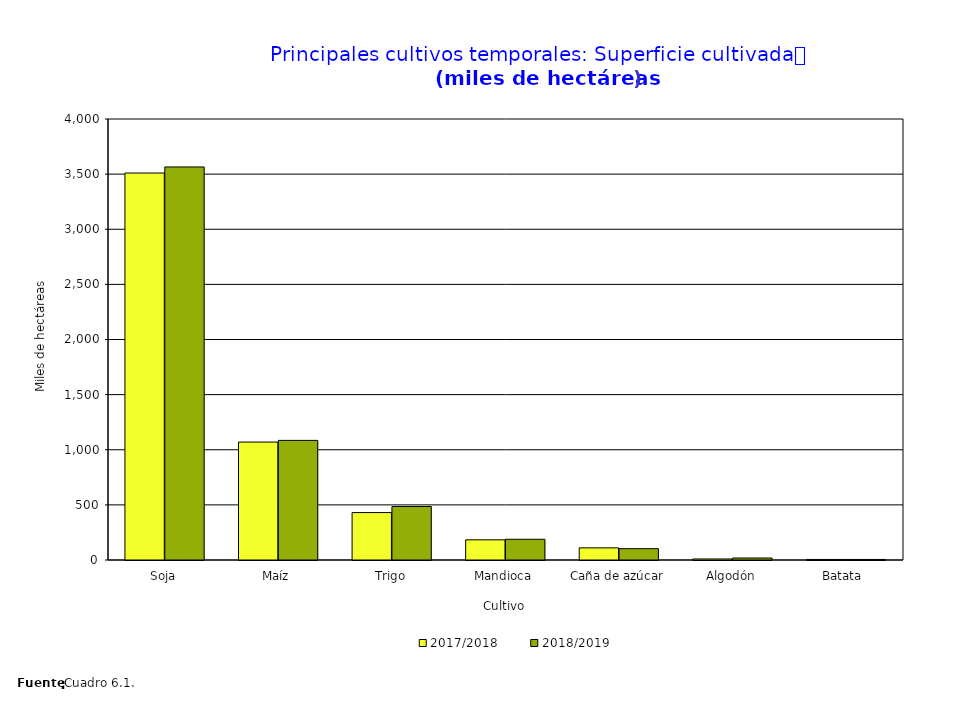
| Category | 2017/2018 | 2018/2019 |
|---|---|---|
| Soja | 3510 | 3565 |
| Maíz | 1070 | 1085.005 |
| Trigo | 430 | 485 |
| Mandioca | 183 | 188 |
| Caña de azúcar | 110 | 103 |
| Algodón | 9.493 | 18 |
| Batata  | 5.078 | 5.087 |